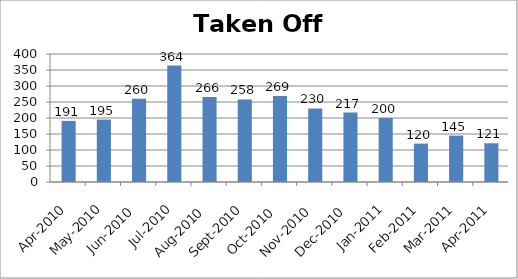
| Category | Series 0 |
|---|---|
| 2010-04-01 | 191 |
| 2010-05-01 | 195 |
| 2010-06-01 | 260 |
| 2010-07-01 | 364 |
| 2010-08-01 | 266 |
| 2010-09-01 | 258 |
| 2010-10-01 | 269 |
| 2010-11-01 | 230 |
| 2010-12-01 | 217 |
| 2011-01-01 | 200 |
| 2011-02-01 | 120 |
| 2011-03-01 | 145 |
| 2011-04-01 | 121 |